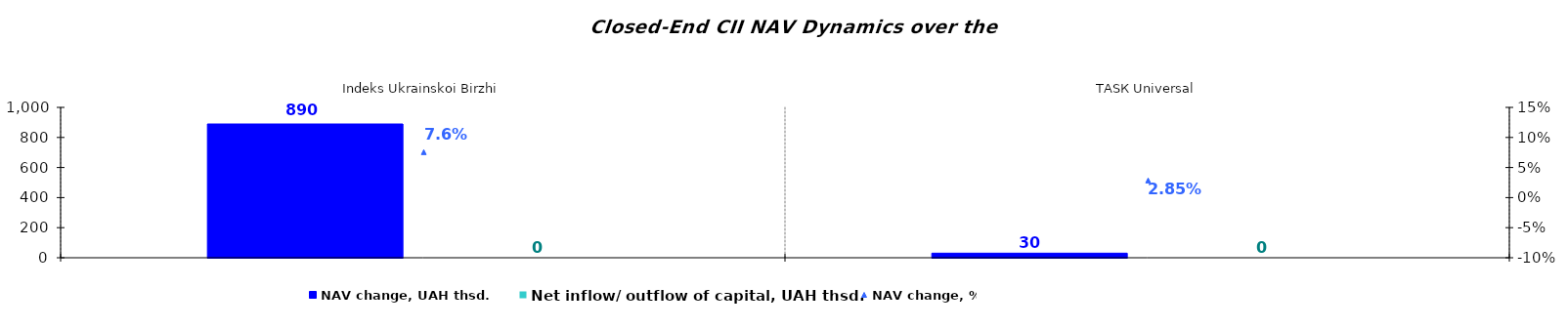
| Category | NAV change, UAH thsd. | Net inflow/ outflow of capital, UAH thsd. |
|---|---|---|
| Іndeks Ukrainskoi Birzhi | 889.606 | 0 |
| ТАSК Universal | 30.296 | 0 |